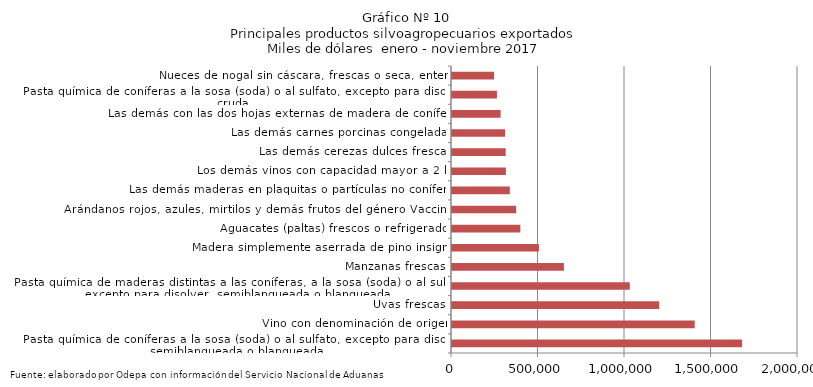
| Category | Series 0 |
|---|---|
| Pasta química de coníferas a la sosa (soda) o al sulfato, excepto para disolver, semiblanqueada o blanqueada | 1677049.75 |
| Vino con denominación de origen | 1402795.162 |
| Uvas frescas | 1197790.464 |
| Pasta química de maderas distintas a las coníferas, a la sosa (soda) o al sulfato, excepto para disolver, semiblanqueada o blanqueada | 1027719.031 |
| Manzanas frescas | 646929.575 |
| Madera simplemente aserrada de pino insigne | 502452.358 |
| Aguacates (paltas) frescos o refrigerados | 395058.067 |
| Arándanos rojos, azules, mirtilos y demás frutos del género Vaccinium | 370958.678 |
| Las demás maderas en plaquitas o partículas no coníferas | 334298.063 |
| Los demás vinos con capacidad mayor a 2 lts | 311496.643 |
| Las demás cerezas dulces frescas | 310588.305 |
| Las demás carnes porcinas congeladas | 306944.379 |
| Las demás con las dos hojas externas de madera de coníferas | 281146.865 |
| Pasta química de coníferas a la sosa (soda) o al sulfato, excepto para disolver, cruda | 259666.514 |
| Nueces de nogal sin cáscara, frescas o seca, enteras | 243193.348 |